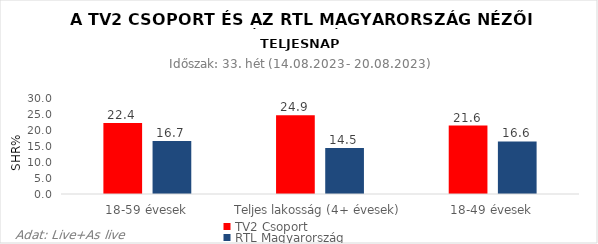
| Category | TV2 Csoport | RTL Magyarország |
|---|---|---|
| 18-59 évesek | 22.4 | 16.7 |
| Teljes lakosság (4+ évesek) | 24.9 | 14.5 |
| 18-49 évesek | 21.6 | 16.6 |